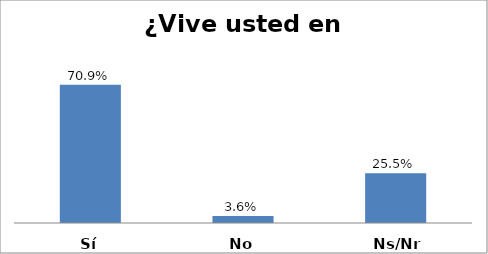
| Category | Series 0 |
|---|---|
| Sí | 0.709 |
| No | 0.036 |
| Ns/Nr | 0.255 |